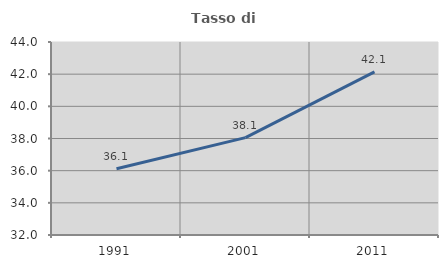
| Category | Tasso di occupazione   |
|---|---|
| 1991.0 | 36.124 |
| 2001.0 | 38.053 |
| 2011.0 | 42.146 |